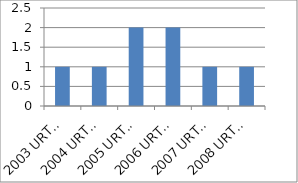
| Category | Series 0 |
|---|---|
| 2003 URTEA | 1 |
| 2004 URTEA | 1 |
| 2005 URTEA | 2 |
|  2006 URTEA | 2 |
| 2007 URTEA | 1 |
| 2008 URTEA | 1 |